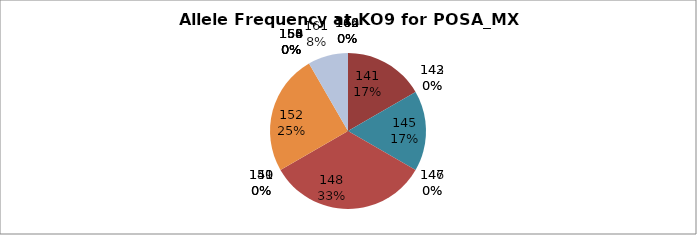
| Category | Series 0 |
|---|---|
| 140.0 | 0 |
| 141.0 | 0.167 |
| 142.0 | 0 |
| 143.0 | 0 |
| 145.0 | 0.167 |
| 146.0 | 0 |
| 147.0 | 0 |
| 148.0 | 0.333 |
| 149.0 | 0 |
| 150.0 | 0 |
| 151.0 | 0 |
| 152.0 | 0.25 |
| 153.0 | 0 |
| 154.0 | 0 |
| 155.0 | 0 |
| 156.0 | 0 |
| 158.0 | 0 |
| 160.0 | 0 |
| 161.0 | 0.083 |
| 162.0 | 0 |
| 164.0 | 0 |
| 166.0 | 0 |